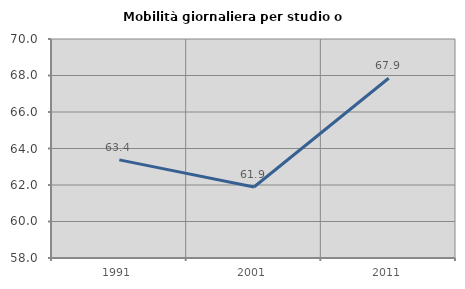
| Category | Mobilità giornaliera per studio o lavoro |
|---|---|
| 1991.0 | 63.377 |
| 2001.0 | 61.891 |
| 2011.0 | 67.85 |